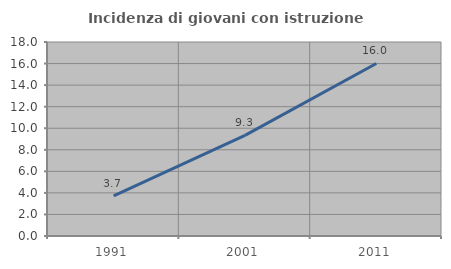
| Category | Incidenza di giovani con istruzione universitaria |
|---|---|
| 1991.0 | 3.714 |
| 2001.0 | 9.333 |
| 2011.0 | 16.01 |